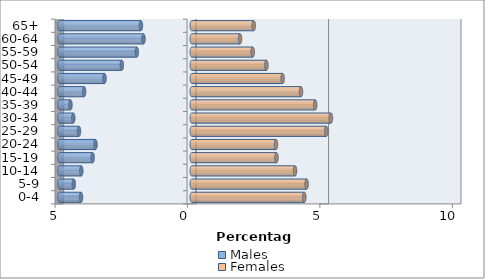
| Category | Males | Females |
|---|---|---|
| 0-4 | -4.181 | 4.25 |
| 5-9 | -4.454 | 4.337 |
| 10-14 | -4.172 | 3.899 |
| 15-19 | -3.743 | 3.197 |
| 20-24 | -3.635 | 3.177 |
| 25-29 | -4.259 | 5.078 |
| 30-34 | -4.474 | 5.253 |
| 35-39 | -4.581 | 4.659 |
| 40-44 | -4.064 | 4.123 |
| 45-49 | -3.294 | 3.431 |
| 50-54 | -2.641 | 2.817 |
| 55-59 | -2.076 | 2.3 |
| 60-64 | -1.823 | 1.823 |
| 65+ | -1.92 | 2.339 |